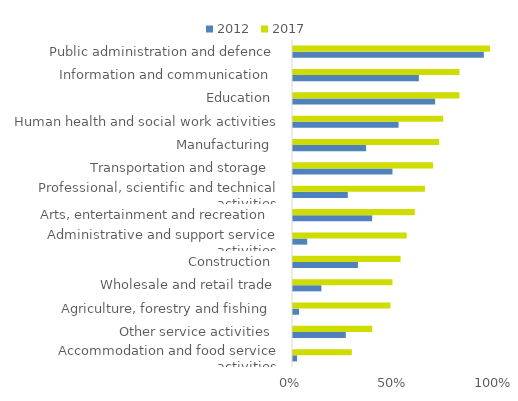
| Category | 2012 | 2017 |
|---|---|---|
| Accommodation and food service activities  | 0.02 | 0.29 |
| Other service activities  | 0.26 | 0.39 |
| Agriculture, forestry and fishing  | 0.03 | 0.48 |
| Wholesale and retail trade | 0.14 | 0.49 |
| Construction  | 0.32 | 0.53 |
| Administrative and support service activities  | 0.07 | 0.56 |
| Arts, entertainment and recreation  | 0.39 | 0.6 |
| Professional, scientific and technical activities  | 0.27 | 0.65 |
| Transportation and storage  | 0.49 | 0.69 |
| Manufacturing  | 0.36 | 0.72 |
| Human health and social work activities  | 0.52 | 0.74 |
| Education  | 0.7 | 0.82 |
| Information and communication  | 0.62 | 0.82 |
| Public administration and defence | 0.94 | 0.97 |